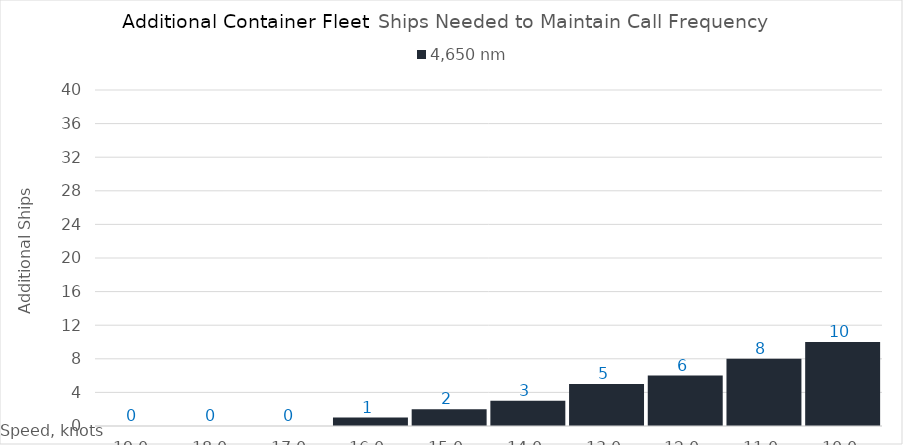
| Category | 4,650 |
|---|---|
| 19.0 | 0 |
| 18.0 | 0 |
| 17.0 | 0 |
| 16.0 | 1 |
| 15.0 | 2 |
| 14.0 | 3 |
| 13.0 | 5 |
| 12.0 | 6 |
| 11.0 | 8 |
| 10.0 | 10 |